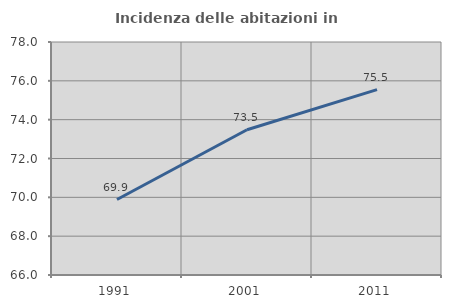
| Category | Incidenza delle abitazioni in proprietà  |
|---|---|
| 1991.0 | 69.887 |
| 2001.0 | 73.48 |
| 2011.0 | 75.547 |